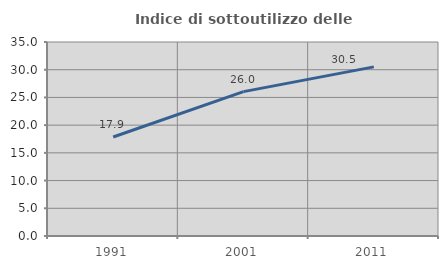
| Category | Indice di sottoutilizzo delle abitazioni  |
|---|---|
| 1991.0 | 17.857 |
| 2001.0 | 26.048 |
| 2011.0 | 30.514 |